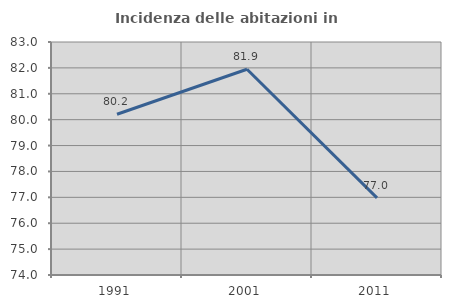
| Category | Incidenza delle abitazioni in proprietà  |
|---|---|
| 1991.0 | 80.209 |
| 2001.0 | 81.949 |
| 2011.0 | 76.977 |